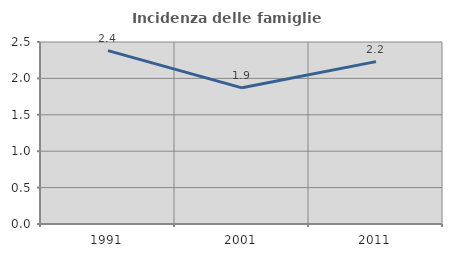
| Category | Incidenza delle famiglie numerose |
|---|---|
| 1991.0 | 2.381 |
| 2001.0 | 1.871 |
| 2011.0 | 2.23 |